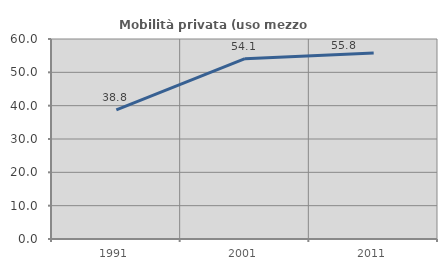
| Category | Mobilità privata (uso mezzo privato) |
|---|---|
| 1991.0 | 38.761 |
| 2001.0 | 54.093 |
| 2011.0 | 55.835 |